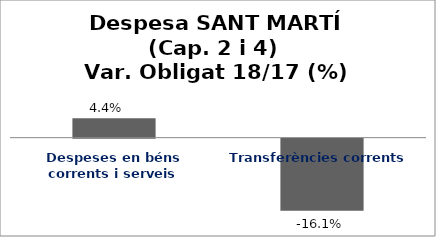
| Category | Series 0 |
|---|---|
| Despeses en béns corrents i serveis | 0.044 |
| Transferències corrents | -0.161 |